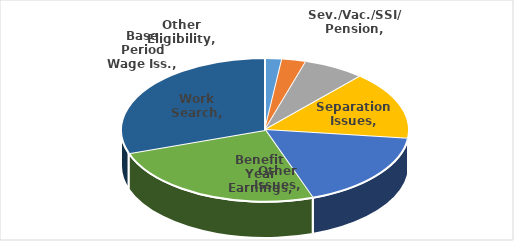
| Category | Series 0 |
|---|---|
| Other Eligibility | 0.019 |
| Sev./Vac./SSI/ Pension | 0.027 |
| Base Period Wage Iss. | 0.069 |
| Separation Issues | 0.154 |
| Other Issues | 0.177 |
| Benefit Year Earnings | 0.251 |
| Work Search | 0.303 |